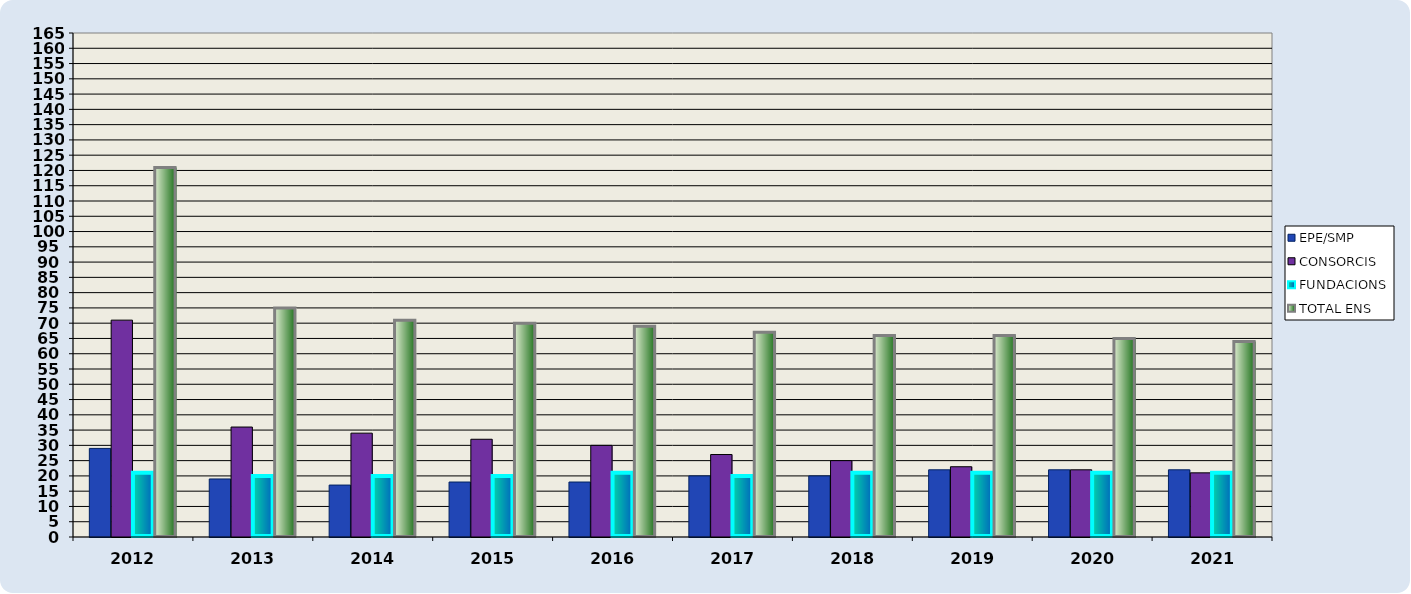
| Category | EPE/SMP | CONSORCIS | FUNDACIONS | TOTAL ENS |
|---|---|---|---|---|
| 2012.0 | 29 | 71 | 21 | 121 |
| 2013.0 | 19 | 36 | 20 | 75 |
| 2014.0 | 17 | 34 | 20 | 71 |
| 2015.0 | 18 | 32 | 20 | 70 |
| 2016.0 | 18 | 30 | 21 | 69 |
| 2017.0 | 20 | 27 | 20 | 67 |
| 2018.0 | 20 | 25 | 21 | 66 |
| 2019.0 | 22 | 23 | 21 | 66 |
| 2020.0 | 22 | 22 | 21 | 65 |
| 2021.0 | 22 | 21 | 21 | 64 |